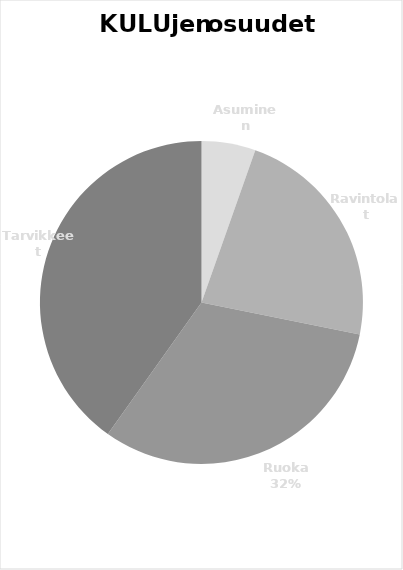
| Category | Total |
|---|---|
| Asuminen | 163.13 |
| Ravintolat | 687.402 |
| Ruoka | 955.681 |
| Tarvikkeet | 1212.047 |